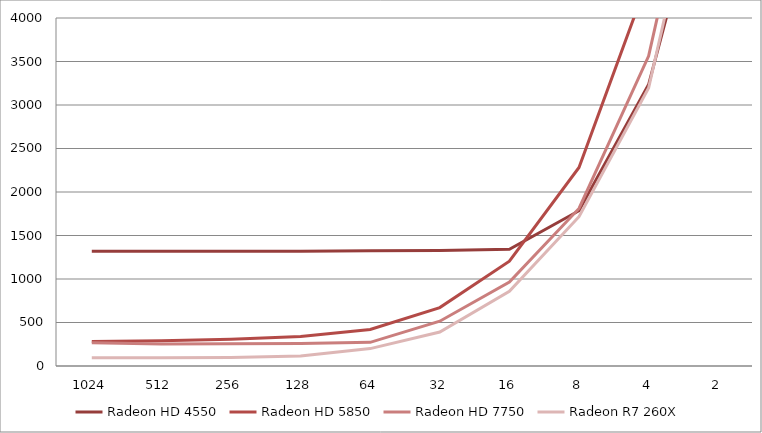
| Category | Radeon HD 4550 | Radeon HD 5850 | Radeon HD 7750 | Radeon R7 260X |
|---|---|---|---|---|
| 1024.0 | 1318 | 282 | 268 | 95 |
| 512.0 | 1318 | 290 | 252 | 96 |
| 256.0 | 1318 | 307 | 255 | 98 |
| 128.0 | 1318 | 340 | 260 | 116 |
| 64.0 | 1326 | 419 | 272 | 200 |
| 32.0 | 1328 | 671 | 515 | 390 |
| 16.0 | 1341 | 1204 | 964 | 858 |
| 8.0 | 1785 | 2282 | 1811 | 1716 |
| 4.0 | 3235 | 4463 | 3562 | 3195 |
| 2.0 | 6247 | 8742 | 7115 | 6713 |